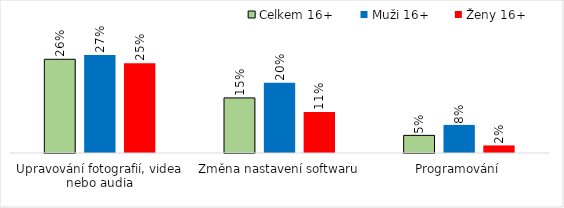
| Category | Celkem 16+ | Muži 16+ | Ženy 16+ |
|---|---|---|---|
| Upravování fotografií, videa nebo audia | 0.26 | 0.272 | 0.249 |
| Změna nastavení softwaru | 0.153 | 0.195 | 0.114 |
| Programování | 0.049 | 0.078 | 0.021 |